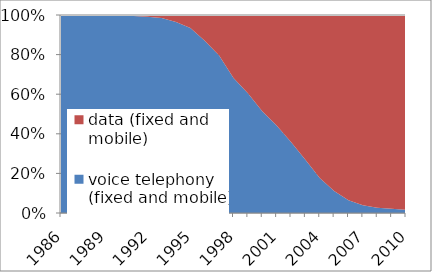
| Category | voice telephony (fixed and mobile) | data (fixed and mobile) |
|---|---|---|
| 1986.0 | 7532315609 | 98776 |
| 1987.0 | 8073413244 | 194896 |
| 1988.0 | 8721191054 | 939764 |
| 1989.0 | 9447486296 | 3554796 |
| 1990.0 | 10254055243 | 16555402 |
| 1991.0 | 11056049514 | 53887403 |
| 1992.0 | 12003189847 | 104102283 |
| 1993.0 | 13146274380 | 203725722 |
| 1994.0 | 14689992384 | 538906524 |
| 1995.0 | 16476383003 | 1155453799 |
| 1996.0 | 18641482518 | 2771974664 |
| 1997.0 | 21065790990 | 5427941334 |
| 1998.0 | 23569676609 | 10969855133 |
| 1999.0 | 27936069762 | 18277897301 |
| 2000.0 | 33392822043 | 31573566019 |
| 2001.0 | 38139112444 | 48099354501 |
| 2002.0 | 41462965392 | 74104788915 |
| 2003.0 | 46390629683 | 126035323849 |
| 2004.0 | 53397680072 | 248010700970 |
| 2005.0 | 61926259751 | 495921792006 |
| 2006.0 | 70943257994 | 1025271050491 |
| 2007.0 | 80416875653 | 1968760316018 |
| 2008.0 | 91062506802 | 3288256320310 |
| 2009.0 | 101620410512 | 4666937997540 |
| 2010.0 | 112720272743 | 7126399912188 |